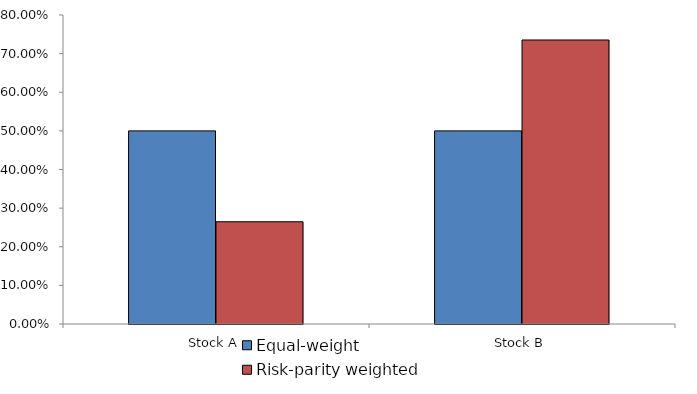
| Category | Equal-weight | Risk-parity weighted |
|---|---|---|
| Stock A | 0.5 | 0.265 |
| Stock B | 0.5 | 0.735 |